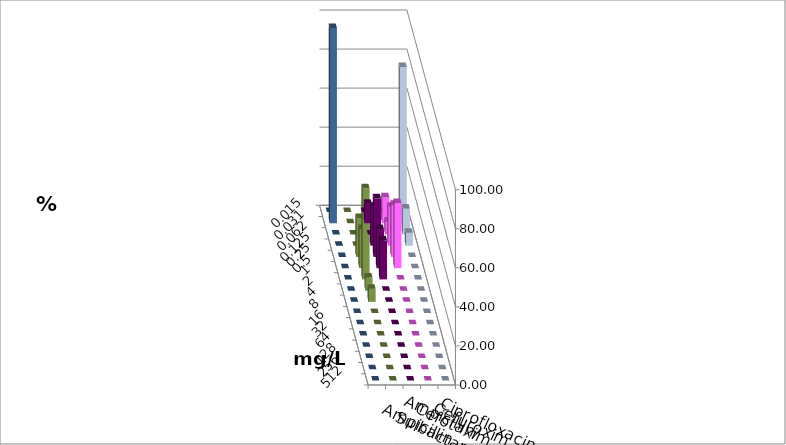
| Category | Ampicillin | Ampicillin/ Sulbactam | Cefotaxim | Cefuroxim | Ciprofloxacin |
|---|---|---|---|---|---|
| 0.015 | 0 | 0 | 0 | 0 | 0 |
| 0.031 | 10 | 13.333 | 80 | 0 | 100 |
| 0.062 | 0 | 6.667 | 13.333 | 0 | 0 |
| 0.125 | 20 | 20 | 6.667 | 0 | 0 |
| 0.25 | 30 | 26.667 | 0 | 20 | 0 |
| 0.5 | 20 | 33.333 | 0 | 20 | 0 |
| 1.0 | 20 | 0 | 0 | 46.667 | 0 |
| 2.0 | 0 | 0 | 0 | 6.667 | 0 |
| 4.0 | 0 | 0 | 0 | 6.667 | 0 |
| 8.0 | 0 | 0 | 0 | 0 | 0 |
| 16.0 | 0 | 0 | 0 | 0 | 0 |
| 32.0 | 0 | 0 | 0 | 0 | 0 |
| 64.0 | 0 | 0 | 0 | 0 | 0 |
| 128.0 | 0 | 0 | 0 | 0 | 0 |
| 256.0 | 0 | 0 | 0 | 0 | 0 |
| 512.0 | 0 | 0 | 0 | 0 | 0 |